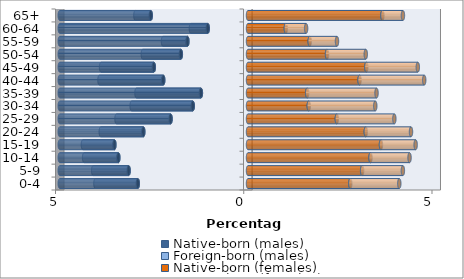
| Category | Native-born (males) | Foreign-born (males) | Native-born (females) | Foreign-born (females) |
|---|---|---|---|---|
| 0-4 | -2.927 | -1.126 | 2.717 | 1.301 |
| 5-9 | -3.171 | -0.942 | 3.032 | 1.082 |
| 10-14 | -3.444 | -0.909 | 3.254 | 1.037 |
| 15-19 | -3.548 | -0.837 | 3.532 | 0.921 |
| 20-24 | -2.78 | -1.13 | 3.128 | 1.201 |
| 25-29 | -2.056 | -1.437 | 2.359 | 1.528 |
| 30-34 | -1.467 | -1.624 | 1.614 | 1.767 |
| 35-39 | -1.251 | -1.711 | 1.571 | 1.843 |
| 40-44 | -2.252 | -1.694 | 2.963 | 1.718 |
| 45-49 | -2.502 | -1.401 | 3.143 | 1.368 |
| 50-54 | -1.784 | -1.01 | 2.099 | 1.029 |
| 55-59 | -1.609 | -0.649 | 1.639 | 0.725 |
| 60-64 | -1.069 | -0.448 | 1.005 | 0.539 |
| 65+ | -2.583 | -0.409 | 3.571 | 0.545 |